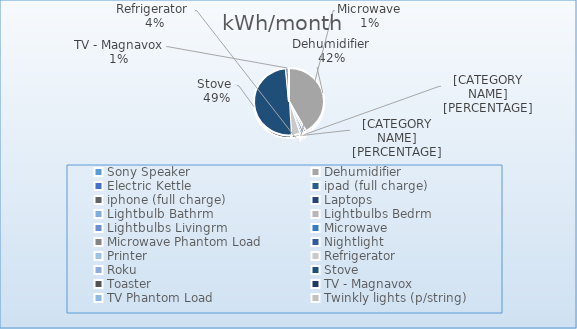
| Category | kWh/month |
|---|---|
| Sony Speaker | 0.608 |
| Dehumidifier | 339.998 |
| Electric Kettle | 3.042 |
| ipad (full charge) | 0.163 |
| iphone (full charge) | 0.456 |
| Laptops | 5.475 |
| Lightbulb Bathrm | 0.395 |
| Lightbulbs Bedrm | 1.582 |
| Lightbulbs Livingrm | 7.908 |
| Microwave | 5.069 |
| Microwave Phantom Load | 1.812 |
| Nightlight | 0.556 |
| Printer | 0.07 |
| Refrigerator  | 31.083 |
| Roku | 1.141 |
| Stove  | 401.5 |
| Toaster | 2.281 |
| TV - Magnavox | 8.213 |
| TV Phantom Load | 0.578 |
| Twinkly lights (p/string) | 1.043 |